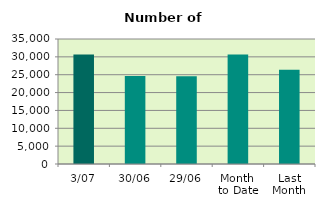
| Category | Series 0 |
|---|---|
| 3/07 | 30682 |
| 30/06 | 24642 |
| 29/06 | 24568 |
| Month 
to Date | 30682 |
| Last
Month | 26399.455 |